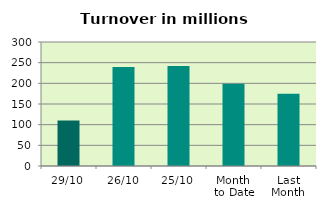
| Category | Series 0 |
|---|---|
| 29/10 | 110.052 |
| 26/10 | 239.634 |
| 25/10 | 241.757 |
| Month 
to Date | 199.124 |
| Last
Month | 174.723 |